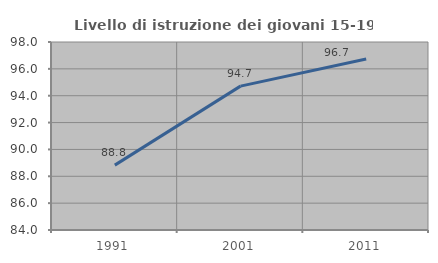
| Category | Livello di istruzione dei giovani 15-19 anni |
|---|---|
| 1991.0 | 88.83 |
| 2001.0 | 94.714 |
| 2011.0 | 96.729 |